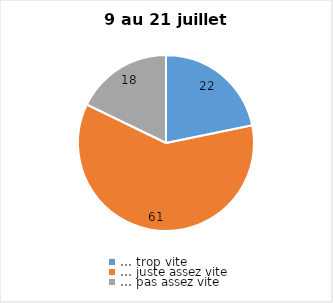
| Category | Series 0 |
|---|---|
| … trop vite | 22 |
| … juste assez vite | 61 |
| … pas assez vite | 18 |